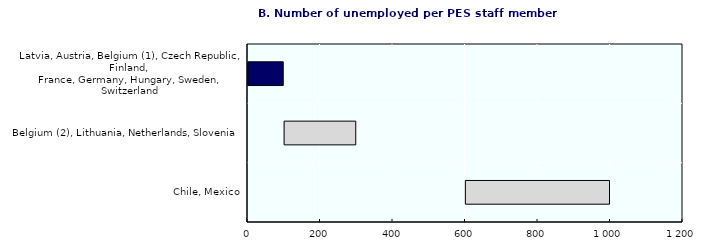
| Category | One | Two-one |
|---|---|---|
| Chile, Mexico | 601 | 399 |
| Belgium (2), Lithuania, Netherlands, Slovenia | 101 | 199 |
| Latvia, Austria, Belgium (1), Czech Republic, Finland, 
France, Germany, Hungary, Sweden, Switzerland | 1 | 99 |